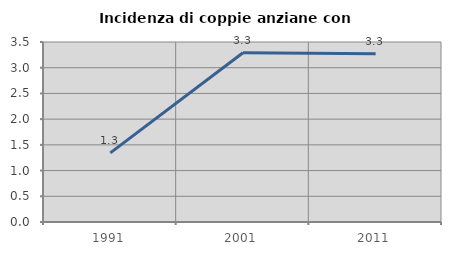
| Category | Incidenza di coppie anziane con figli |
|---|---|
| 1991.0 | 1.345 |
| 2001.0 | 3.291 |
| 2011.0 | 3.27 |